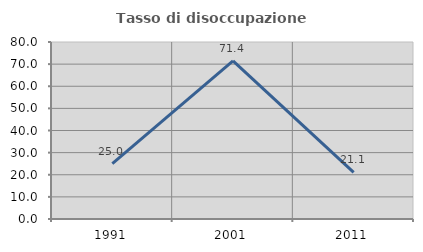
| Category | Tasso di disoccupazione giovanile  |
|---|---|
| 1991.0 | 25 |
| 2001.0 | 71.429 |
| 2011.0 | 21.053 |